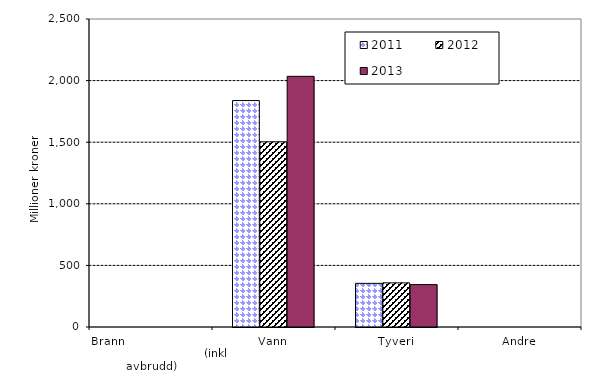
| Category | 2011 | 2012 | 2013 |
|---|---|---|---|
| Brann                                                       (inkl avbrudd) | 0 | 0 | 0 |
| Vann | 1838.004 | 1502.788 | 2034.663 |
| Tyveri | 354.27 | 358.262 | 344.015 |
| Andre | 0 | 0 | 0 |